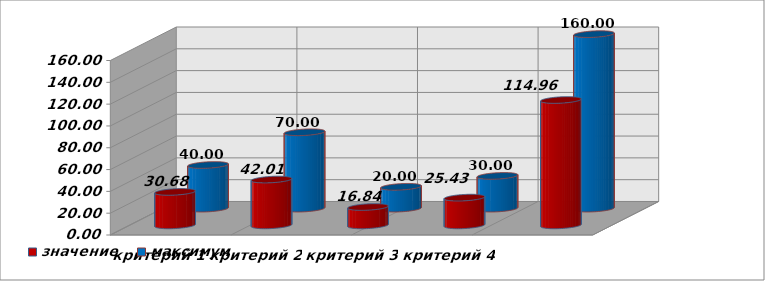
| Category | значение | максимум |
|---|---|---|
| критерий 1 | 30.68 | 40 |
| критерий 2 | 42.01 | 70 |
| критерий 3 | 16.84 | 20 |
| критерий 4 | 25.43 | 30 |